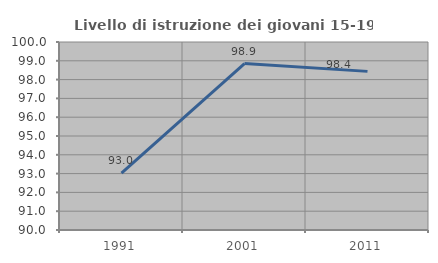
| Category | Livello di istruzione dei giovani 15-19 anni |
|---|---|
| 1991.0 | 93.023 |
| 2001.0 | 98.851 |
| 2011.0 | 98.438 |